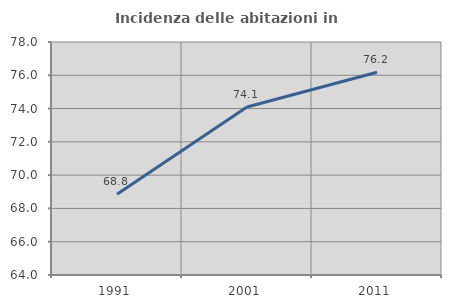
| Category | Incidenza delle abitazioni in proprietà  |
|---|---|
| 1991.0 | 68.85 |
| 2001.0 | 74.094 |
| 2011.0 | 76.182 |